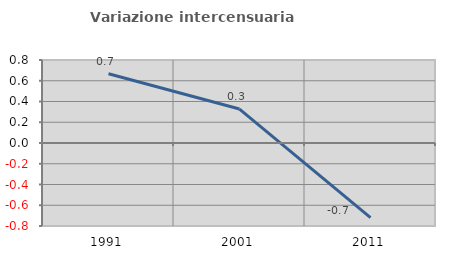
| Category | Variazione intercensuaria annua |
|---|---|
| 1991.0 | 0.667 |
| 2001.0 | 0.327 |
| 2011.0 | -0.719 |